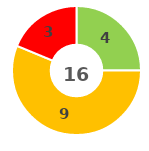
| Category | Series 0 |
|---|---|
| 0 | 0 |
| 1 | 4 |
| 2 | 9 |
| 3 | 3 |
| 4 | 0 |